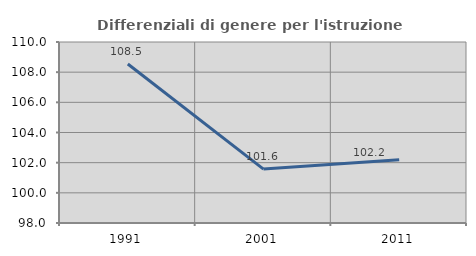
| Category | Differenziali di genere per l'istruzione superiore |
|---|---|
| 1991.0 | 108.542 |
| 2001.0 | 101.572 |
| 2011.0 | 102.188 |